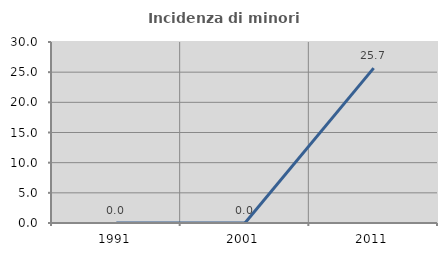
| Category | Incidenza di minori stranieri |
|---|---|
| 1991.0 | 0 |
| 2001.0 | 0 |
| 2011.0 | 25.664 |